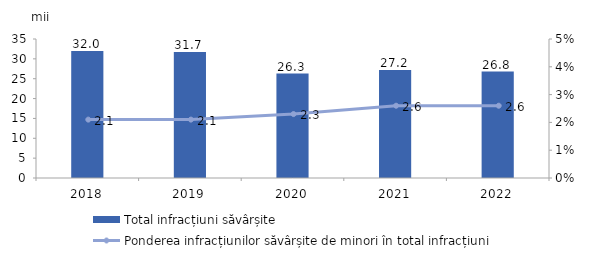
| Category | Total infracțiuni săvârșite |
|---|---|
| 2018.0 | 32 |
| 2019.0 | 31.7 |
| 2020.0 | 26.3 |
| 2021.0 | 27.2 |
| 2022.0 | 26.8 |